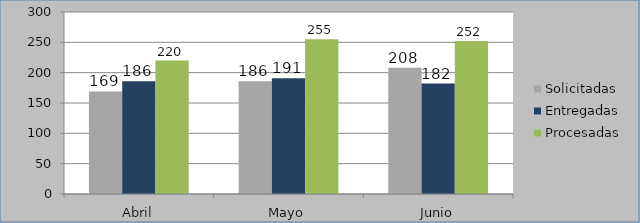
| Category | Solicitadas | Entregadas | Procesadas |
|---|---|---|---|
| Abril | 169 | 186 | 220 |
| Mayo | 186 | 191 | 255 |
| Junio | 208 | 182 | 252 |